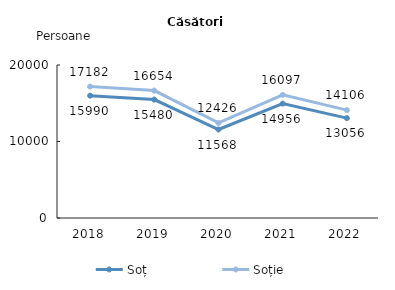
| Category | Soț | Soție |
|---|---|---|
| 2018.0 | 15990 | 17182 |
| 2019.0 | 15480 | 16654 |
| 2020.0 | 11568 | 12426 |
| 2021.0 | 14956 | 16097 |
| 2022.0 | 13056 | 14106 |